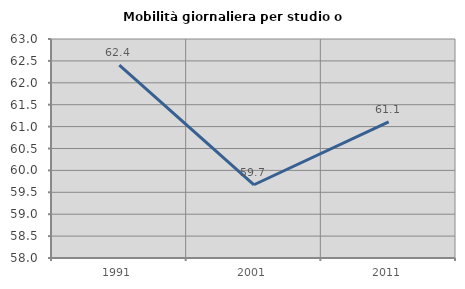
| Category | Mobilità giornaliera per studio o lavoro |
|---|---|
| 1991.0 | 62.401 |
| 2001.0 | 59.672 |
| 2011.0 | 61.107 |